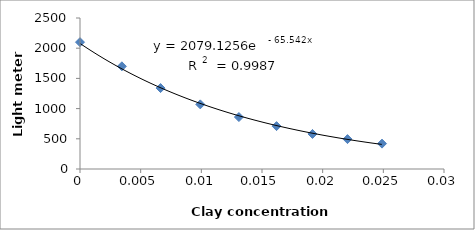
| Category | Series 0 |
|---|---|
| 0.0 | 2100 |
| 0.0034516765285996 | 1700 |
| 0.00664024475038242 | 1340 |
| 0.00991219646041981 | 1070 |
| 0.0130973331528361 | 860 |
| 0.0161990647962592 | 710 |
| 0.0191597414589104 | 580 |
| 0.0220463722808389 | 495 |
| 0.0248906611782866 | 420 |